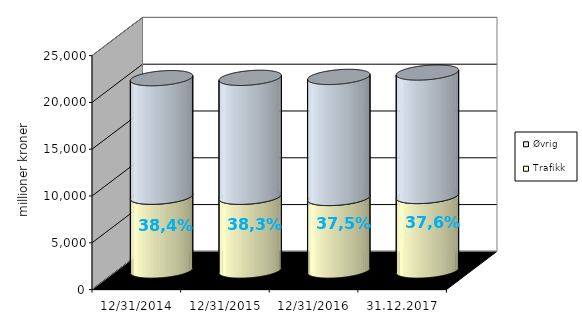
| Category | Trafikk | Øvrig |
|---|---|---|
| 31.12.2014 | 7884.668 | 12665.925 |
| 31.12.2015 | 7875.825 | 12707.863 |
| 31.12.2016 | 7750.819 | 12931.461 |
| 31.12.2017 | 7961.353 | 13190.728 |